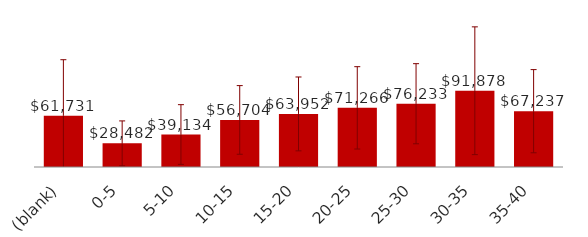
| Category | Total |
|---|---|
| (blank) | 61731.065 |
| 0-5 | 28482.113 |
| 5-10 | 39133.844 |
| 10-15 | 56704.162 |
| 15-20 | 63951.941 |
| 20-25 | 71265.649 |
| 25-30 | 76233.362 |
| 30-35 | 91877.626 |
| 35-40 | 67237.285 |